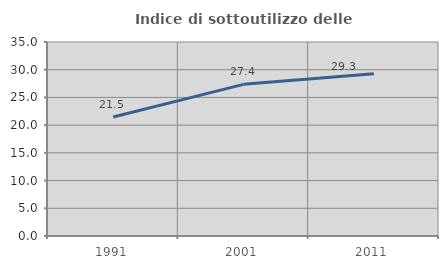
| Category | Indice di sottoutilizzo delle abitazioni  |
|---|---|
| 1991.0 | 21.478 |
| 2001.0 | 27.356 |
| 2011.0 | 29.255 |